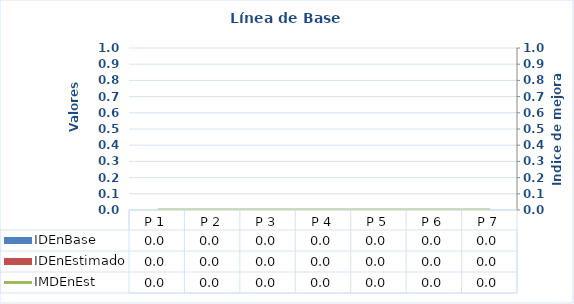
| Category | IDEnBase | IDEnEstimado |
|---|---|---|
| P 1 | 0 | 0 |
| P 2 | 0 | 0 |
| P 3 | 0 | 0 |
| P 4 | 0 | 0 |
| P 5 | 0 | 0 |
| P 6 | 0 | 0 |
| P 7 | 0 | 0 |